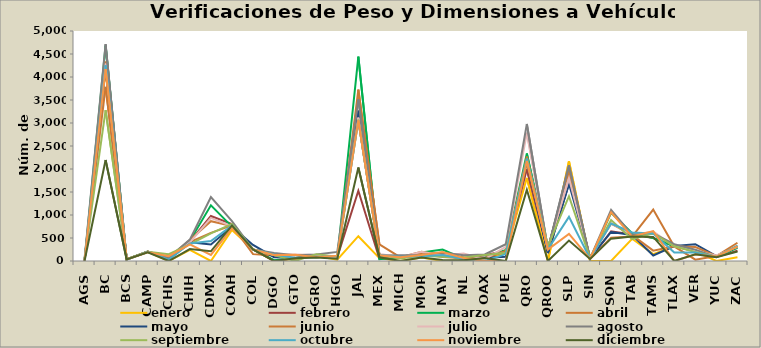
| Category | enero | febrero | marzo | abril | mayo | junio | julio | agosto | septiembre | octubre | noviembre | diciembre |
|---|---|---|---|---|---|---|---|---|---|---|---|---|
| AGS | 0 | 0 | 0 | 0 | 0 | 0 | 0 | 40 | 47 | 0 | 0 | 0 |
| BC | 4152 | 4205 | 4682 | 3784 | 4194 | 4335 | 4293 | 4714 | 3280 | 4251 | 4172 | 2195 |
| BCS | 33 | 36 | 38 | 34 | 36 | 35 | 31 | 35 | 35 | 30 | 36 | 32 |
| CAMP | 200 | 203 | 204 | 207 | 201 | 200 | 202 | 202 | 202 | 202 | 190 | 187 |
| CHIS | 0 | 80 | 56 | 66 | 32 | 73 | 98 | 68 | 147 | 31 | 104 | 0 |
| CHIH | 241 | 422 | 437 | 411 | 405 | 455 | 404 | 465 | 360 | 379 | 362 | 260 |
| CDMX | 0 | 979 | 1211 | 612 | 360 | 866 | 938 | 1389 | 600 | 436 | 133 | 211 |
| COAH | 676 | 804 | 747 | 774 | 743 | 758 | 754 | 865 | 806 | 768 | 716 | 772 |
| COL | 250 | 250 | 250 | 150 | 350 | 250 | 250 | 250 | 250 | 250 | 250 | 250 |
| DGO | 0 | 0 | 18 | 117 | 83 | 130 | 130 | 173 | 130 | 143 | 130 | 0 |
| GTO | 50 | 64 | 65 | 55 | 68 | 50 | 143 | 126 | 0 | 65 | 137 | 60 |
| GRO | 110 | 110 | 112 | 92 | 110 | 120 | 132 | 140 | 149 | 80 | 80 | 75 |
| HGO | 30 | 84 | 64 | 60 | 60 | 60 | 60 | 197 | 95 | 113 | 116 | 50 |
| JAL | 539 | 1527 | 4441 | 3727 | 3270 | 3581 | 3115 | 3516 | 3071 | 3056 | 3056 | 2033 |
| MEX | 62 | 50 | 40 | 360 | 120 | 120 | 152 | 120 | 120 | 120 | 120 | 80 |
| MICH | 0 | 80 | 80 | 80 | 80 | 84 | 80 | 125 | 57 | 95 | 80 | 0 |
| MOR | 75 | 157 | 184 | 198 | 144 | 159 | 198 | 129 | 114 | 104 | 130 | 75 |
| NAY | 0 | 170 | 248 | 126 | 129 | 86 | 122 | 184 | 93 | 132 | 195 | 23 |
| NL | 9 | 55 | 50 | 84 | 42 | 60 | 163 | 124 | 75 | 42 | 63 | 14 |
| OAX | 57 | 127 | 67 | 57 | 68 | 67 | 41 | 142 | 130 | 0 | 0 | 66 |
| PUE | 167 | 226 | 238 | 213 | 94 | 217 | 306 | 365 | 180 | 150 | 0 | 0 |
| QRO | 1807 | 1994 | 2336 | 2139 | 2170 | 2269 | 2787 | 2979 | 2188 | 2226 | 2176 | 1550 |
| QROO | 0 | 202 | 257 | 265 | 172 | 251 | 277 | 250 | 326 | 254 | 251 | 0 |
| SLP | 2172 | 1855 | 1980 | 1960 | 1680 | 1900 | 1800 | 2080 | 1409 | 960 | 590 | 445 |
| SIN | 0 | 49 | 41 | 44 | 65 | 75 | 55 | 50 | 61 | 48 | 45 | 45 |
| SON | 0 | 645 | 1049 | 504 | 631 | 811 | 821 | 1113 | 891 | 814 | 1060 | 486 |
| TAB | 483 | 577 | 603 | 530 | 566 | 562 | 565 | 568 | 475 | 621 | 531 | 530 |
| TAMS | 150 | 500 | 500 | 1117 | 120 | 225 | 640 | 600 | 600 | 600 | 650 | 523 |
| TLAX | 318 | 319 | 319 | 316 | 324 | 318 | 318 | 365 | 319 | 185 | 0 | 0 |
| VER | 210 | 213 | 220 | 30 | 366 | 302 | 214 | 248 | 196 | 186 | 143 | 148 |
| YUC | 0 | 88 | 87 | 107 | 106 | 112 | 122 | 85 | 91 | 88 | 97 | 84 |
| ZAC | 81 | 222 | 287 | 397 | 301 | 309 | 306 | 328 | 317 | 334 | 317 | 207 |